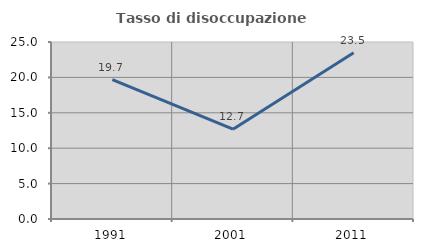
| Category | Tasso di disoccupazione giovanile  |
|---|---|
| 1991.0 | 19.675 |
| 2001.0 | 12.687 |
| 2011.0 | 23.496 |